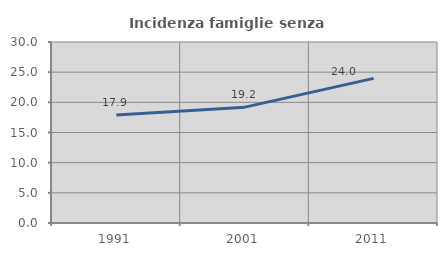
| Category | Incidenza famiglie senza nuclei |
|---|---|
| 1991.0 | 17.885 |
| 2001.0 | 19.205 |
| 2011.0 | 23.968 |